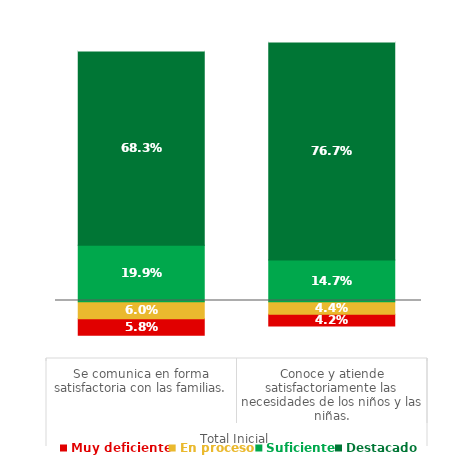
| Category | Series 0 | Muy deficiente | En proceso | Suficiente | Destacado | Series 5 |
|---|---|---|---|---|---|---|
| 0 | 0.082 | 0.058 | 0.06 | 0.199 | 0.683 | 0.118 |
| 1 | 0.114 | 0.042 | 0.044 | 0.147 | 0.767 | 0.086 |